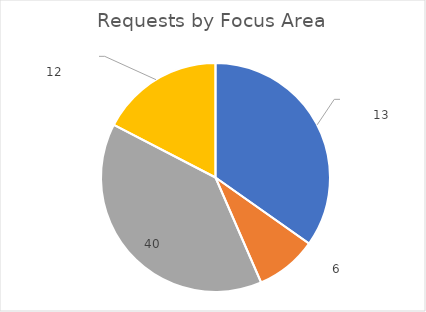
| Category | Series 0 |
|---|---|
| Educated & Capable Community  | 8 |
| Environmental Stewardship  | 2 |
| Resident Well-Being  | 9 |
| Vibrant Economy  | 4 |